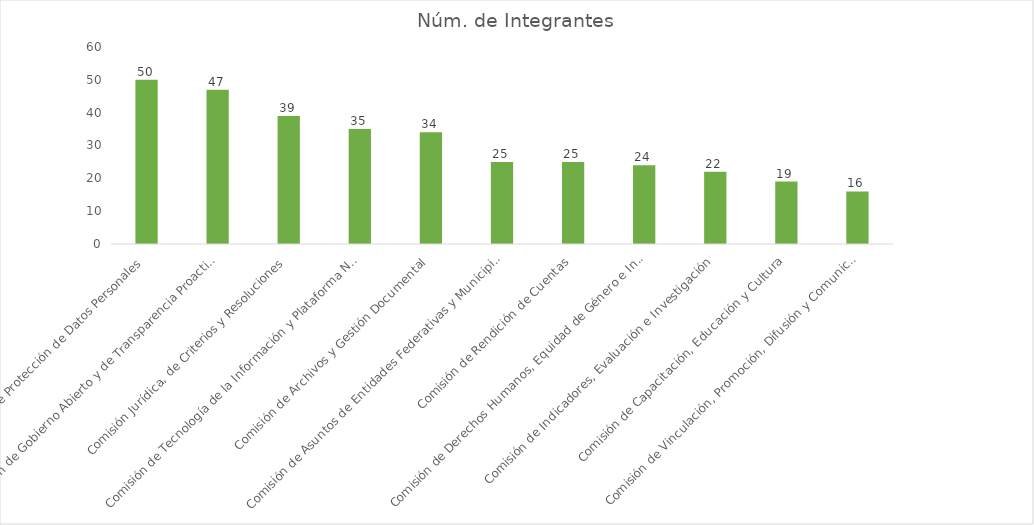
| Category | Núm. de Integrantes |
|---|---|
| Comisión de Protección de Datos Personales | 50 |
| Comisión de Gobierno Abierto y de Transparencia Proactiva | 47 |
| Comisión Jurídica, de Criterios y Resoluciones | 39 |
| Comisión de Tecnología de la Información y Plataforma Nacional de Transparencia | 35 |
| Comisión de Archivos y Gestión Documental | 34 |
| Comisión de Asuntos de Entidades Federativas y Municipios  | 25 |
| Comisión de Rendición de Cuentas | 25 |
| Comisión de Derechos Humanos, Equidad de Género e Inclusión Social | 24 |
| Comisión de Indicadores, Evaluación e Investigación | 22 |
| Comisión de Capacitación, Educación y Cultura | 19 |
| Comisión de Vinculación, Promoción, Difusión y Comunicación Social | 16 |